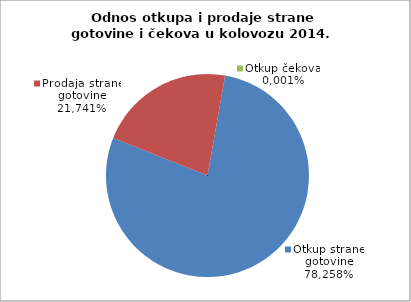
| Category | Otkup strane gotovine |
|---|---|
| 0 | 0.783 |
| 1 | 0.217 |
| 2 | 0 |